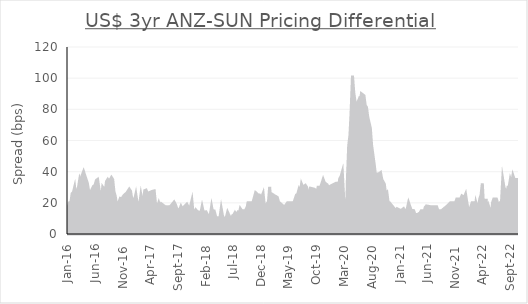
| Category | Diff. |
|---|---|
| 2022-10-13 | 35 |
| 2022-10-06 | 35 |
| 2022-09-29 | 35 |
| 2022-09-22 | 35 |
| 2022-09-15 | 37.5 |
| 2022-09-08 | 32.5 |
| 2022-09-01 | 35 |
| 2022-08-25 | 30 |
| 2022-08-19 | 30 |
| 2022-08-12 | 25 |
| 2022-08-05 | 27.5 |
| 2022-07-28 | 30 |
| 2022-07-21 | 35 |
| 2022-07-14 | 20 |
| 2022-07-07 | 20 |
| 2022-06-30 | 17.5 |
| 2022-06-23 | 20 |
| 2022-06-16 | 22.5 |
| 2022-06-09 | 22.5 |
| 2022-06-02 | 22.5 |
| 2022-05-26 | 20 |
| 2022-05-19 | 10 |
| 2022-05-12 | 15 |
| 2022-05-05 | 17.5 |
| 2022-04-28 | 12.5 |
| 2022-04-21 | 22.5 |
| 2022-04-13 | 12.5 |
| 2022-04-07 | 17.5 |
| 2022-03-31 | 32.5 |
| 2022-03-24 | 25 |
| 2022-03-17 | 22.5 |
| 2022-03-10 | 17.5 |
| 2022-03-03 | 17 |
| 2022-02-24 | 20 |
| 2022-02-17 | 12.5 |
| 2022-02-10 | 20 |
| 2022-02-03 | 20 |
| 2022-01-20 | 15 |
| 2022-01-13 | 15 |
| 2022-01-06 | 19.5 |
| 2021-12-29 | 25.5 |
| 2021-12-22 | 23.5 |
| 2021-12-16 | 24 |
| 2021-12-09 | 24.5 |
| 2021-12-02 | 22.5 |
| 2021-11-11 | 22.5 |
| 2021-11-04 | 20 |
| 2021-10-28 | 20 |
| 2021-10-21 | 20 |
| 2021-10-14 | 20 |
| 2021-10-07 | 20 |
| 2021-09-30 | 19.167 |
| 2021-09-23 | 18.333 |
| 2021-08-20 | 15 |
| 2021-08-13 | 15 |
| 2021-08-06 | 15 |
| 2021-07-30 | 15 |
| 2021-07-23 | 17.5 |
| 2021-07-16 | 17.5 |
| 2021-07-09 | 17.5 |
| 2021-07-02 | 17.5 |
| 2021-06-25 | 17.5 |
| 2021-06-21 | 17.5 |
| 2021-05-28 | 18 |
| 2021-05-21 | 17 |
| 2021-05-14 | 13.5 |
| 2021-05-07 | 15 |
| 2021-04-30 | 15 |
| 2021-04-23 | 13.5 |
| 2021-04-09 | 12.5 |
| 2021-03-26 | 12.5 |
| 2021-03-19 | 15 |
| 2021-03-05 | 15.25 |
| 2021-02-19 | 20 |
| 2021-02-12 | 16.25 |
| 2021-02-05 | 15 |
| 2021-01-29 | 14.375 |
| 2021-01-22 | 16.25 |
| 2021-01-15 | 15.625 |
| 2021-01-08 | 15 |
| 2020-12-18 | 16.25 |
| 2020-12-11 | 15 |
| 2020-11-06 | 20 |
| 2020-10-30 | 20 |
| 2020-10-23 | 26.5 |
| 2020-10-16 | 25.5 |
| 2020-10-09 | 32 |
| 2020-10-02 | 33.5 |
| 2020-09-25 | 35 |
| 2020-09-18 | 39.375 |
| 2020-09-11 | 38.75 |
| 2020-08-21 | 38.125 |
| 2020-08-14 | 45 |
| 2020-08-07 | 51 |
| 2020-07-31 | 57 |
| 2020-07-24 | 68 |
| 2020-07-17 | 71.5 |
| 2020-07-10 | 75 |
| 2020-07-03 | 81.25 |
| 2020-06-26 | 82.5 |
| 2020-06-19 | 88.75 |
| 2020-06-05 | 90 |
| 2020-05-29 | 83 |
| 2020-05-22 | 86 |
| 2020-05-15 | 84 |
| 2020-05-08 | 74.5 |
| 2020-05-01 | 85 |
| 2020-04-24 | 90.833 |
| 2020-04-17 | 101.667 |
| 2020-04-09 | 77.5 |
| 2020-04-03 | 63.333 |
| 2020-03-27 | 56.667 |
| 2020-03-20 | 35 |
| 2020-03-16 | 15 |
| 2020-03-06 | 20 |
| 2020-03-03 | 15.625 |
| 2020-02-21 | 39.75 |
| 2020-02-14 | 36.875 |
| 2020-02-07 | 35.5 |
| 2020-01-31 | 30 |
| 2020-01-24 | 32.5 |
| 2020-01-17 | 32.5 |
| 2019-12-06 | 30 |
| 2019-11-29 | 31.667 |
| 2019-11-15 | 32.833 |
| 2019-11-08 | 35 |
| 2019-10-25 | 30 |
| 2019-10-18 | 30 |
| 2019-10-11 | 30 |
| 2019-10-04 | 25 |
| 2019-09-27 | 28.125 |
| 2019-09-20 | 28.75 |
| 2019-08-30 | 29.375 |
| 2019-08-23 | 25 |
| 2019-08-16 | 26.25 |
| 2019-08-09 | 30 |
| 2019-08-02 | 31.25 |
| 2019-07-19 | 30 |
| 2019-07-12 | 32 |
| 2019-07-05 | 26.5 |
| 2019-06-28 | 28.5 |
| 2019-06-21 | 25.5 |
| 2019-06-14 | 25 |
| 2019-05-31 | 20 |
| 2019-05-24 | 20 |
| 2019-05-17 | 20 |
| 2019-05-10 | 20 |
| 2019-04-26 | 20 |
| 2019-04-12 | 17.667 |
| 2019-04-03 | 17.833 |
| 2019-03-08 | 20.5 |
| 2019-03-01 | 23.5 |
| 2019-02-22 | 24 |
| 2019-02-15 | 22 |
| 2019-02-08 | 25 |
| 2019-02-01 | 25.5 |
| 2019-01-25 | 20.333 |
| 2019-01-18 | 30.167 |
| 2019-01-11 | 20 |
| 2019-01-07 | 20 |
| 2018-12-21 | 17 |
| 2018-12-13 | 26 |
| 2018-12-03 | 23 |
| 2018-11-23 | 25 |
| 2018-11-16 | 25 |
| 2018-11-02 | 26.5 |
| 2018-10-26 | 23.5 |
| 2018-10-19 | 20.5 |
| 2018-10-12 | 20 |
| 2018-10-05 | 20 |
| 2018-09-28 | 20 |
| 2018-09-21 | 20 |
| 2018-09-17 | 17.5 |
| 2018-09-07 | 15 |
| 2018-08-31 | 15 |
| 2018-08-17 | 15 |
| 2018-08-10 | 16.25 |
| 2018-08-03 | 12.5 |
| 2018-07-27 | 13.75 |
| 2018-07-20 | 12.5 |
| 2018-07-12 | 13.75 |
| 2018-07-06 | 12.5 |
| 2018-06-29 | 11.786 |
| 2018-06-22 | 9 |
| 2018-06-15 | 10.357 |
| 2018-06-08 | 12.143 |
| 2018-06-01 | 13.929 |
| 2018-05-25 | 10.714 |
| 2018-05-18 | 10 |
| 2018-05-11 | 9.6 |
| 2018-05-04 | 11.7 |
| 2018-04-27 | 16.3 |
| 2018-04-20 | 10.5 |
| 2018-04-06 | 10.5 |
| 2018-03-29 | 10.5 |
| 2018-03-19 | 14.8 |
| 2018-03-09 | 15 |
| 2018-03-05 | 17.5 |
| 2018-02-23 | 10 |
| 2018-02-12 | 12.125 |
| 2018-02-02 | 14.25 |
| 2018-01-19 | 13.875 |
| 2018-01-12 | 17.5 |
| 2018-01-05 | 13.5 |
| 2017-12-15 | 14.5 |
| 2017-12-08 | 15.5 |
| 2017-12-01 | 14 |
| 2017-11-24 | 12.5 |
| 2017-11-17 | 21.357 |
| 2017-11-10 | 18 |
| 2017-11-03 | 15 |
| 2017-10-27 | 17.5 |
| 2017-10-20 | 19.167 |
| 2017-10-13 | 18.333 |
| 2017-10-06 | 17.5 |
| 2017-09-29 | 15.929 |
| 2017-09-22 | 16.857 |
| 2017-09-18 | 17.786 |
| 2017-09-08 | 14.714 |
| 2017-09-01 | 15.643 |
| 2017-08-25 | 16.571 |
| 2017-08-18 | 19 |
| 2017-08-11 | 20.5 |
| 2017-08-04 | 19.5 |
| 2017-07-28 | 18.5 |
| 2017-07-21 | 17.5 |
| 2017-07-14 | 17.5 |
| 2017-07-07 | 15 |
| 2017-06-30 | 17.5 |
| 2017-06-23 | 17.5 |
| 2017-06-16 | 18.125 |
| 2017-06-09 | 18.75 |
| 2017-06-02 | 19.375 |
| 2017-05-26 | 17.5 |
| 2017-05-19 | 20 |
| 2017-05-12 | 17.5 |
| 2017-05-05 | 15 |
| 2017-04-24 | 27.667 |
| 2017-04-12 | 27.333 |
| 2017-04-07 | 27 |
| 2017-03-31 | 26.667 |
| 2017-03-23 | 26.333 |
| 2017-03-17 | 26 |
| 2017-03-10 | 28.167 |
| 2017-03-03 | 27.833 |
| 2017-02-23 | 20 |
| 2017-02-17 | 20.5 |
| 2017-02-10 | 25 |
| 2017-02-03 | 19 |
| 2017-01-30 | 17 |
| 2017-01-20 | 20 |
| 2017-01-13 | 25.375 |
| 2017-01-05 | 21.25 |
| 2016-12-21 | 23.125 |
| 2016-12-15 | 27.5 |
| 2016-12-08 | 28.75 |
| 2016-12-01 | 27.5 |
| 2016-11-24 | 26.25 |
| 2016-11-11 | 25 |
| 2016-11-03 | 23.75 |
| 2016-10-28 | 22.5 |
| 2016-10-20 | 22.857 |
| 2016-10-13 | 20.714 |
| 2016-10-07 | 18.571 |
| 2016-09-29 | 18.929 |
| 2016-09-22 | 24.286 |
| 2016-09-15 | 27.143 |
| 2016-09-08 | 35 |
| 2016-09-01 | 36.25 |
| 2016-08-26 | 35 |
| 2016-08-19 | 33.75 |
| 2016-08-12 | 35 |
| 2016-08-05 | 33.75 |
| 2016-07-29 | 27.5 |
| 2016-07-22 | 28.75 |
| 2016-07-15 | 30 |
| 2016-07-08 | 21.875 |
| 2016-07-01 | 13.75 |
| 2016-06-29 | 25.625 |
| 2016-06-17 | 35 |
| 2016-06-10 | 34.375 |
| 2016-06-03 | 31.25 |
| 2016-05-26 | 30.625 |
| 2016-05-23 | 30 |
| 2016-05-13 | 27.5 |
| 2016-05-06 | 27.5 |
| 2016-04-29 | 27.5 |
| 2016-04-22 | 32.5 |
| 2016-04-15 | 35 |
| 2016-04-08 | 37.5 |
| 2016-04-01 | 40 |
| 2016-03-24 | 37.5 |
| 2016-03-18 | 32.5 |
| 2016-03-11 | 35 |
| 2016-03-04 | 30 |
| 2016-02-26 | 27.5 |
| 2016-02-19 | 22.5 |
| 2016-02-12 | 30 |
| 2016-02-05 | 26.667 |
| 2016-01-29 | 25.833 |
| 2016-01-22 | 20 |
| 2016-01-15 | 20 |
| 2016-01-08 | 17.5 |